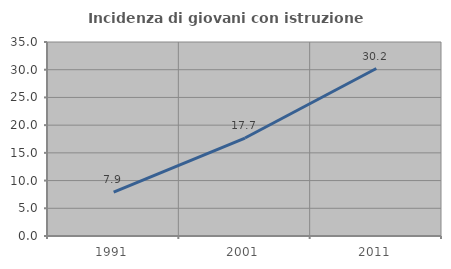
| Category | Incidenza di giovani con istruzione universitaria |
|---|---|
| 1991.0 | 7.911 |
| 2001.0 | 17.677 |
| 2011.0 | 30.211 |